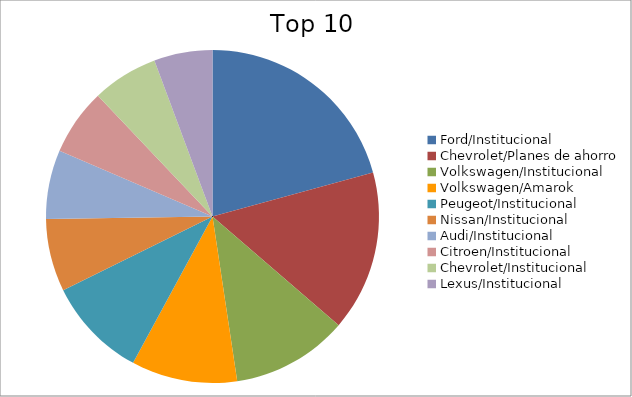
| Category | Series 0 |
|---|---|
| Ford/Institucional | 12.72 |
| Chevrolet/Planes de ahorro | 9.56 |
| Volkswagen/Institucional | 6.94 |
| Volkswagen/Amarok | 6.31 |
| Peugeot/Institucional | 6.01 |
| Nissan/Institucional | 4.32 |
| Audi/Institucional | 4.11 |
| Citroen/Institucional | 3.97 |
| Chevrolet/Institucional | 3.93 |
| Lexus/Institucional | 3.48 |